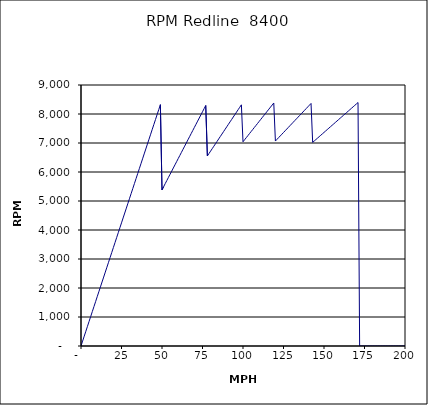
| Category | RPM Redline  8400 |
|---|---|
| 0.0 | 0 |
| 1.0 | 169.833 |
| 2.0 | 339.666 |
| 3.0 | 509.499 |
| 4.0 | 679.332 |
| 5.0 | 849.165 |
| 6.0 | 1018.998 |
| 7.0 | 1188.831 |
| 8.0 | 1358.664 |
| 9.0 | 1528.497 |
| 10.0 | 1698.33 |
| 11.0 | 1868.163 |
| 12.0 | 2037.996 |
| 13.0 | 2207.829 |
| 14.0 | 2377.662 |
| 15.0 | 2547.495 |
| 16.0 | 2717.328 |
| 17.0 | 2887.161 |
| 18.0 | 3056.994 |
| 19.0 | 3226.827 |
| 20.0 | 3396.66 |
| 21.0 | 3566.492 |
| 22.0 | 3736.325 |
| 23.0 | 3906.158 |
| 24.0 | 4075.991 |
| 25.0 | 4245.824 |
| 26.0 | 4415.657 |
| 27.0 | 4585.49 |
| 28.0 | 4755.323 |
| 29.0 | 4925.156 |
| 30.0 | 5094.989 |
| 31.0 | 5264.822 |
| 32.0 | 5434.655 |
| 33.0 | 5604.488 |
| 34.0 | 5774.321 |
| 35.0 | 5944.154 |
| 36.0 | 6113.987 |
| 37.0 | 6283.82 |
| 38.0 | 6453.653 |
| 39.0 | 6623.486 |
| 40.0 | 6793.319 |
| 41.0 | 6963.152 |
| 42.0 | 7132.985 |
| 43.0 | 7302.818 |
| 44.0 | 7472.651 |
| 45.0 | 7642.484 |
| 46.0 | 7812.317 |
| 47.0 | 7982.15 |
| 48.0 | 8151.983 |
| 49.0 | 8321.816 |
| 50.0 | 5384.948 |
| 51.0 | 5492.647 |
| 52.0 | 5600.346 |
| 53.0 | 5708.045 |
| 54.0 | 5815.744 |
| 55.0 | 5923.443 |
| 56.0 | 6031.142 |
| 57.0 | 6138.841 |
| 58.0 | 6246.54 |
| 59.0 | 6354.239 |
| 60.0 | 6461.938 |
| 61.0 | 6569.637 |
| 62.0 | 6677.336 |
| 63.0 | 6785.035 |
| 64.0 | 6892.733 |
| 65.0 | 7000.432 |
| 66.0 | 7108.131 |
| 67.0 | 7215.83 |
| 68.0 | 7323.529 |
| 69.0 | 7431.228 |
| 70.0 | 7538.927 |
| 71.0 | 7646.626 |
| 72.0 | 7754.325 |
| 73.0 | 7862.024 |
| 74.0 | 7969.723 |
| 75.0 | 8077.422 |
| 76.0 | 8185.121 |
| 77.0 | 8292.82 |
| 78.0 | 6552.405 |
| 79.0 | 6636.41 |
| 80.0 | 6720.415 |
| 81.0 | 6804.42 |
| 82.0 | 6888.426 |
| 83.0 | 6972.431 |
| 84.0 | 7056.436 |
| 85.0 | 7140.441 |
| 86.0 | 7224.446 |
| 87.0 | 7308.451 |
| 88.0 | 7392.457 |
| 89.0 | 7476.462 |
| 90.0 | 7560.467 |
| 91.0 | 7644.472 |
| 92.0 | 7728.477 |
| 93.0 | 7812.483 |
| 94.0 | 7896.488 |
| 95.0 | 7980.493 |
| 96.0 | 8064.498 |
| 97.0 | 8148.503 |
| 98.0 | 8232.509 |
| 99.0 | 8316.514 |
| 100.0 | 7041.855 |
| 101.0 | 7112.274 |
| 102.0 | 7182.692 |
| 103.0 | 7253.111 |
| 104.0 | 7323.529 |
| 105.0 | 7393.948 |
| 106.0 | 7464.366 |
| 107.0 | 7534.785 |
| 108.0 | 7605.204 |
| 109.0 | 7675.622 |
| 110.0 | 7746.041 |
| 111.0 | 7816.459 |
| 112.0 | 7886.878 |
| 113.0 | 7957.296 |
| 114.0 | 8027.715 |
| 115.0 | 8098.133 |
| 116.0 | 8168.552 |
| 117.0 | 8238.97 |
| 118.0 | 8309.389 |
| 119.0 | 8379.808 |
| 120.0 | 7067.744 |
| 121.0 | 7126.642 |
| 122.0 | 7185.54 |
| 123.0 | 7244.438 |
| 124.0 | 7303.336 |
| 125.0 | 7362.234 |
| 126.0 | 7421.131 |
| 127.0 | 7480.029 |
| 128.0 | 7538.927 |
| 129.0 | 7597.825 |
| 130.0 | 7656.723 |
| 131.0 | 7715.621 |
| 132.0 | 7774.519 |
| 133.0 | 7833.417 |
| 134.0 | 7892.314 |
| 135.0 | 7951.212 |
| 136.0 | 8010.11 |
| 137.0 | 8069.008 |
| 138.0 | 8127.906 |
| 139.0 | 8186.804 |
| 140.0 | 8245.702 |
| 141.0 | 8304.6 |
| 142.0 | 8363.497 |
| 143.0 | 7021.022 |
| 144.0 | 7070.12 |
| 145.0 | 7119.218 |
| 146.0 | 7168.316 |
| 147.0 | 7217.414 |
| 148.0 | 7266.512 |
| 149.0 | 7315.61 |
| 150.0 | 7364.708 |
| 151.0 | 7413.806 |
| 152.0 | 7462.904 |
| 153.0 | 7512.002 |
| 154.0 | 7561.101 |
| 155.0 | 7610.199 |
| 156.0 | 7659.297 |
| 157.0 | 7708.395 |
| 158.0 | 7757.493 |
| 159.0 | 7806.591 |
| 160.0 | 7855.689 |
| 161.0 | 7904.787 |
| 162.0 | 7953.885 |
| 163.0 | 8002.983 |
| 164.0 | 8052.081 |
| 165.0 | 8101.179 |
| 166.0 | 8150.277 |
| 167.0 | 8199.375 |
| 168.0 | 8248.473 |
| 169.0 | 8297.571 |
| 170.0 | 8346.669 |
| 171.0 | 8395.767 |
| 172.0 | 0 |
| 173.0 | 0 |
| 174.0 | 0 |
| 175.0 | 0 |
| 176.0 | 0 |
| 177.0 | 0 |
| 178.0 | 0 |
| 179.0 | 0 |
| 180.0 | 0 |
| 181.0 | 0 |
| 182.0 | 0 |
| 183.0 | 0 |
| 184.0 | 0 |
| 185.0 | 0 |
| 186.0 | 0 |
| 187.0 | 0 |
| 188.0 | 0 |
| 189.0 | 0 |
| 190.0 | 0 |
| 191.0 | 0 |
| 192.0 | 0 |
| 193.0 | 0 |
| 194.0 | 0 |
| 195.0 | 0 |
| 196.0 | 0 |
| 197.0 | 0 |
| 198.0 | 0 |
| 199.0 | 0 |
| 200.0 | 0 |